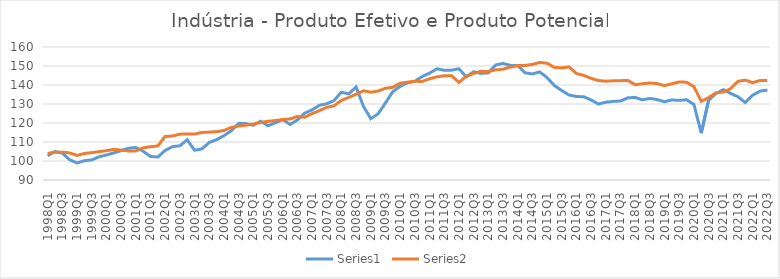
| Category | Series 0 | Series 1 |
|---|---|---|
| 1998Q1 | 102.762 | 103.953 |
| 1998Q2 | 105.026 | 104.667 |
| 1998Q3 | 104.171 | 104.667 |
| 1998Q4 | 100.637 | 104.225 |
| 1999Q1 | 98.978 | 102.939 |
| 1999Q2 | 100.157 | 103.961 |
| 1999Q3 | 100.576 | 104.402 |
| 1999Q4 | 102.216 | 104.955 |
| 2000Q1 | 103.155 | 105.419 |
| 2000Q2 | 104.262 | 106.12 |
| 2000Q3 | 105.427 | 105.796 |
| 2000Q4 | 106.739 | 105.272 |
| 2001Q1 | 107.079 | 105.327 |
| 2001Q2 | 105.162 | 106.927 |
| 2001Q3 | 102.388 | 107.528 |
| 2001Q4 | 102.093 | 107.916 |
| 2002Q1 | 105.586 | 112.929 |
| 2002Q2 | 107.566 | 113.136 |
| 2002Q3 | 108.023 | 114.128 |
| 2002Q4 | 111.189 | 114.199 |
| 2003Q1 | 105.642 | 114.156 |
| 2003Q2 | 106.359 | 115.028 |
| 2003Q3 | 109.745 | 115.198 |
| 2003Q4 | 111.235 | 115.463 |
| 2004Q1 | 113.329 | 116.007 |
| 2004Q2 | 115.856 | 117.673 |
| 2004Q3 | 119.773 | 118.376 |
| 2004Q4 | 119.754 | 118.842 |
| 2005Q1 | 118.797 | 119.451 |
| 2005Q2 | 120.929 | 120.283 |
| 2005Q3 | 118.538 | 120.879 |
| 2005Q4 | 120.09 | 121.284 |
| 2006Q1 | 121.791 | 121.814 |
| 2006Q2 | 119.231 | 122.127 |
| 2006Q3 | 121.576 | 123.404 |
| 2006Q4 | 125.213 | 123.041 |
| 2007Q1 | 126.865 | 124.94 |
| 2007Q2 | 129.319 | 126.486 |
| 2007Q3 | 130.122 | 128.253 |
| 2007Q4 | 131.822 | 129.034 |
| 2008Q1 | 136.227 | 131.913 |
| 2008Q2 | 135.316 | 133.454 |
| 2008Q3 | 138.967 | 135.144 |
| 2008Q4 | 128.774 | 136.944 |
| 2009Q1 | 122.283 | 136.199 |
| 2009Q2 | 124.859 | 136.826 |
| 2009Q3 | 130.58 | 138.259 |
| 2009Q4 | 136.506 | 138.807 |
| 2010Q1 | 139.276 | 140.942 |
| 2010Q2 | 141.149 | 141.511 |
| 2010Q3 | 141.955 | 141.925 |
| 2010Q4 | 144.44 | 141.875 |
| 2011Q1 | 146.242 | 143.282 |
| 2011Q2 | 148.509 | 144.276 |
| 2011Q3 | 147.783 | 144.868 |
| 2011Q4 | 147.798 | 144.916 |
| 2012Q1 | 148.551 | 141.381 |
| 2012Q2 | 144.288 | 144.549 |
| 2012Q3 | 146.964 | 146.096 |
| 2012Q4 | 146.116 | 147.226 |
| 2013Q1 | 146.389 | 147.078 |
| 2013Q2 | 150.515 | 147.965 |
| 2013Q3 | 151.353 | 148.321 |
| 2013Q4 | 150.321 | 149.425 |
| 2014Q1 | 150.296 | 150.184 |
| 2014Q2 | 146.409 | 150.289 |
| 2014Q3 | 145.806 | 150.821 |
| 2014Q4 | 146.884 | 151.884 |
| 2015Q1 | 143.892 | 151.453 |
| 2015Q2 | 139.709 | 149.265 |
| 2015Q3 | 137.105 | 149.005 |
| 2015Q4 | 134.726 | 149.489 |
| 2016Q1 | 133.968 | 146.035 |
| 2016Q2 | 133.805 | 145.045 |
| 2016Q3 | 132.136 | 143.497 |
| 2016Q4 | 129.983 | 142.341 |
| 2017Q1 | 130.943 | 142.007 |
| 2017Q2 | 131.366 | 142.205 |
| 2017Q3 | 131.59 | 142.27 |
| 2017Q4 | 133.229 | 142.443 |
| 2018Q1 | 133.468 | 140.154 |
| 2018Q2 | 132.182 | 140.665 |
| 2018Q3 | 132.928 | 141.048 |
| 2018Q4 | 132.333 | 140.717 |
| 2019Q1 | 131.199 | 139.676 |
| 2019Q2 | 132.146 | 140.635 |
| 2019Q3 | 131.921 | 141.611 |
| 2019Q4 | 132.242 | 141.474 |
| 2020Q1 | 129.789 | 139.191 |
| 2020Q2 | 114.701 | 131.461 |
| 2020Q3 | 131.932 | 133.331 |
| 2020Q4 | 135.534 | 135.865 |
| 2021Q1 | 137.543 | 136.299 |
| 2021Q2 | 135.607 | 138.027 |
| 2021Q3 | 133.798 | 141.92 |
| 2021Q4 | 130.754 | 142.574 |
| 2022Q1 | 134.621 | 141.207 |
| 2022Q2 | 136.756 | 142.372 |
| 2022Q3 | 137.353 | 142.332 |